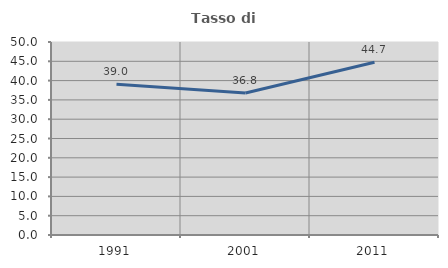
| Category | Tasso di occupazione   |
|---|---|
| 1991.0 | 39.024 |
| 2001.0 | 36.771 |
| 2011.0 | 44.737 |